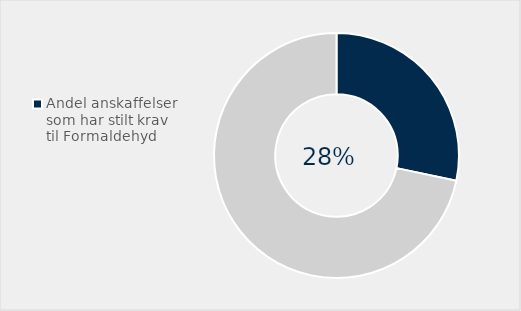
| Category | Series 0 |
|---|---|
| Andel anskaffelser som har stilt krav til Formaldehyd | 0.283 |
| Ikke brukt  | 0.717 |